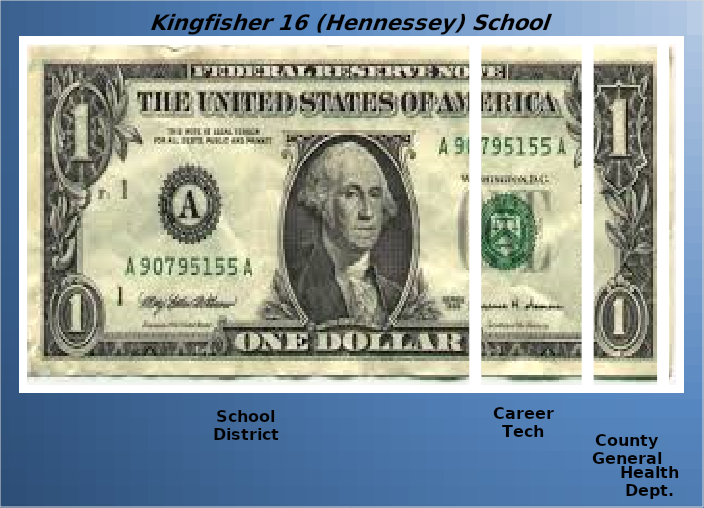
| Category | School District | Career Tech | County General | Health Dept. |
|---|---|---|---|---|
| 0 | 0.687 | 0.17 | 0.114 | 0.029 |